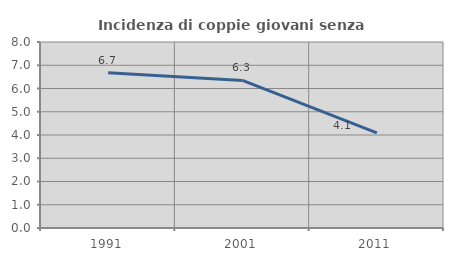
| Category | Incidenza di coppie giovani senza figli |
|---|---|
| 1991.0 | 6.676 |
| 2001.0 | 6.347 |
| 2011.0 | 4.088 |